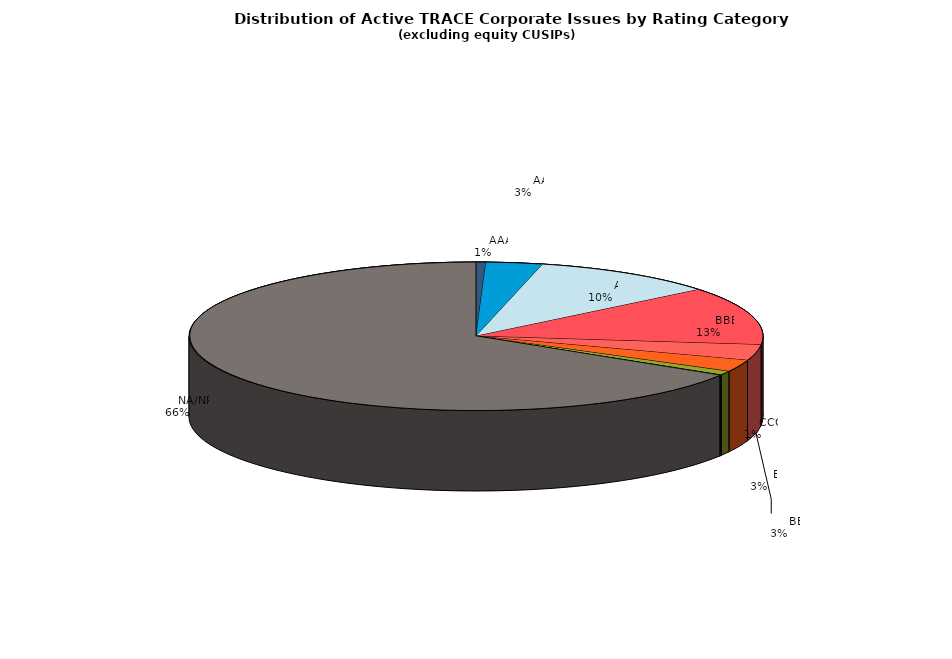
| Category | Series 0 |
|---|---|
|         AAA | 509 |
|         AA | 2930 |
|         A | 9567 |
|         BBB | 11628 |
|         BB | 3145 |
|         B | 2377 |
|         CCC | 799 |
|         CC | 53 |
|         C | 21 |
|         D | 46 |
|         NA/NR | 60747 |